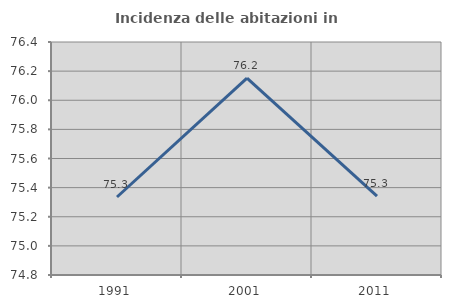
| Category | Incidenza delle abitazioni in proprietà  |
|---|---|
| 1991.0 | 75.336 |
| 2001.0 | 76.151 |
| 2011.0 | 75.342 |